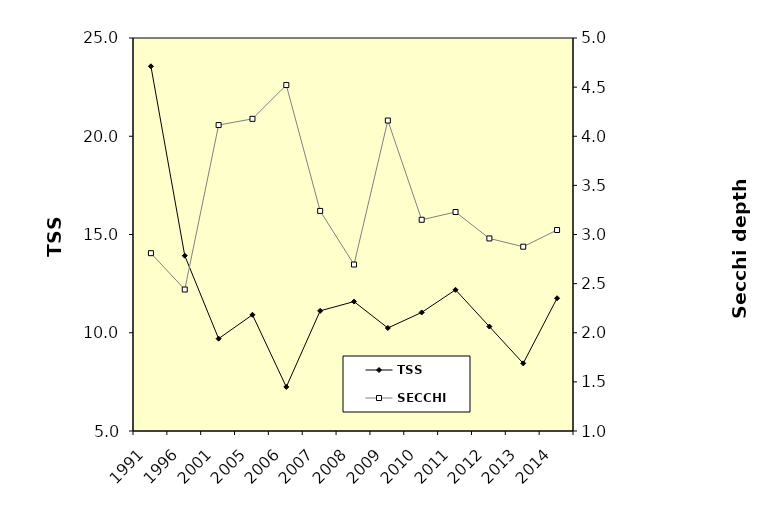
| Category | TSS |
|---|---|
| 1991.0 | 23.56 |
| 1996.0 | 13.92 |
| 2001.0 | 9.7 |
| 2005.0 | 10.914 |
| 2006.0 | 7.243 |
| 2007.0 | 11.114 |
| 2008.0 | 11.586 |
| 2009.0 | 10.243 |
| 2010.0 | 11.033 |
| 2011.0 | 12.186 |
| 2012.0 | 10.314 |
| 2013.0 | 8.443 |
| 2014.0 | 11.757 |